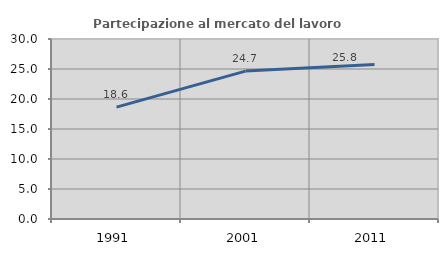
| Category | Partecipazione al mercato del lavoro  femminile |
|---|---|
| 1991.0 | 18.644 |
| 2001.0 | 24.653 |
| 2011.0 | 25.769 |